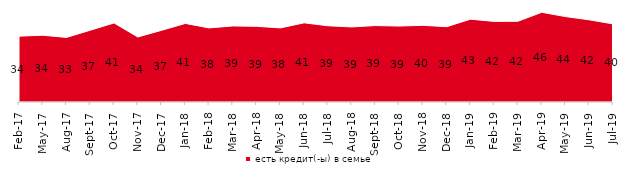
| Category | есть кредит(-ы) в семье |
|---|---|
| 2017-02-01 | 33.95 |
| 2017-05-01 | 34.4 |
| 2017-08-01 | 33.3 |
| 2017-09-01 | 37 |
| 2017-10-01 | 40.75 |
| 2017-11-01 | 33.5 |
| 2017-12-01 | 36.95 |
| 2018-01-01 | 40.5 |
| 2018-02-01 | 38.2 |
| 2018-03-01 | 39.2 |
| 2018-04-01 | 39 |
| 2018-05-01 | 38.2 |
| 2018-06-01 | 40.8 |
| 2018-07-01 | 39.3 |
| 2018-08-01 | 38.7 |
| 2018-09-01 | 39.4 |
| 2018-10-01 | 39.15 |
| 2018-11-01 | 39.521 |
| 2018-12-01 | 38.8 |
| 2019-01-01 | 42.7 |
| 2019-02-01 | 41.55 |
| 2019-03-01 | 41.621 |
| 2019-04-01 | 46.238 |
| 2019-05-01 | 44.032 |
| 2019-06-01 | 42.344 |
| 2019-07-01 | 40.248 |